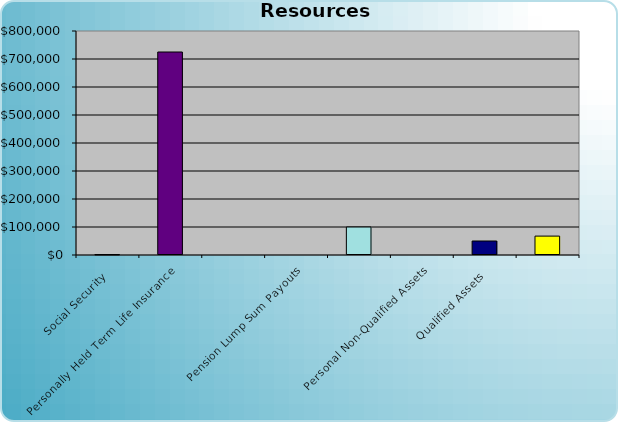
| Category | Series 0 |
|---|---|
| Social Security | 255 |
| Personally Held Term Life Insurance | 725000 |
|   | 0 |
| Pension Lump Sum Payouts | 0 |
|   | 100000 |
| Personal Non-Qualified Assets | 0 |
| Qualified Assets | 50000 |